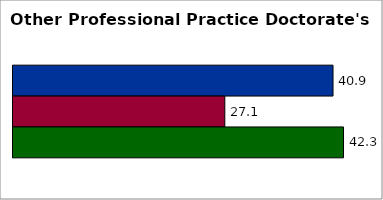
| Category | 50 states and D.C. | SREB states | State |
|---|---|---|---|
| 0 | 40.912 | 27.079 | 42.254 |